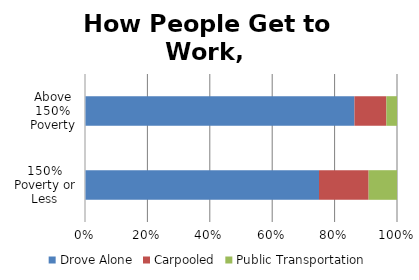
| Category | Drove Alone | Carpooled | Public Transportation |
|---|---|---|---|
| 150% Poverty or Less | 0.66 | 0.14 | 0.08 |
| Above 150% Poverty | 0.76 | 0.09 | 0.03 |